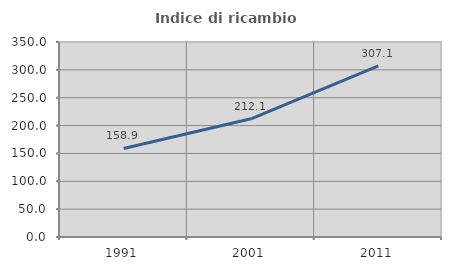
| Category | Indice di ricambio occupazionale  |
|---|---|
| 1991.0 | 158.904 |
| 2001.0 | 212.121 |
| 2011.0 | 307.143 |